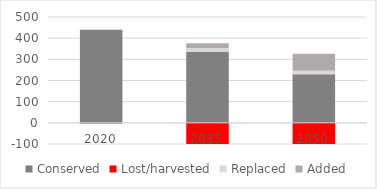
| Category | Conserved | Lost/harvested | Replaced | Added |
|---|---|---|---|---|
| 2020.0 | 440 | 0 | 0 | 0 |
| 2035.0 | 339.9 | -113.3 | 18.025 | 18.025 |
| 2050.0 | 233.398 | -116.699 | 18.566 | 74.263 |